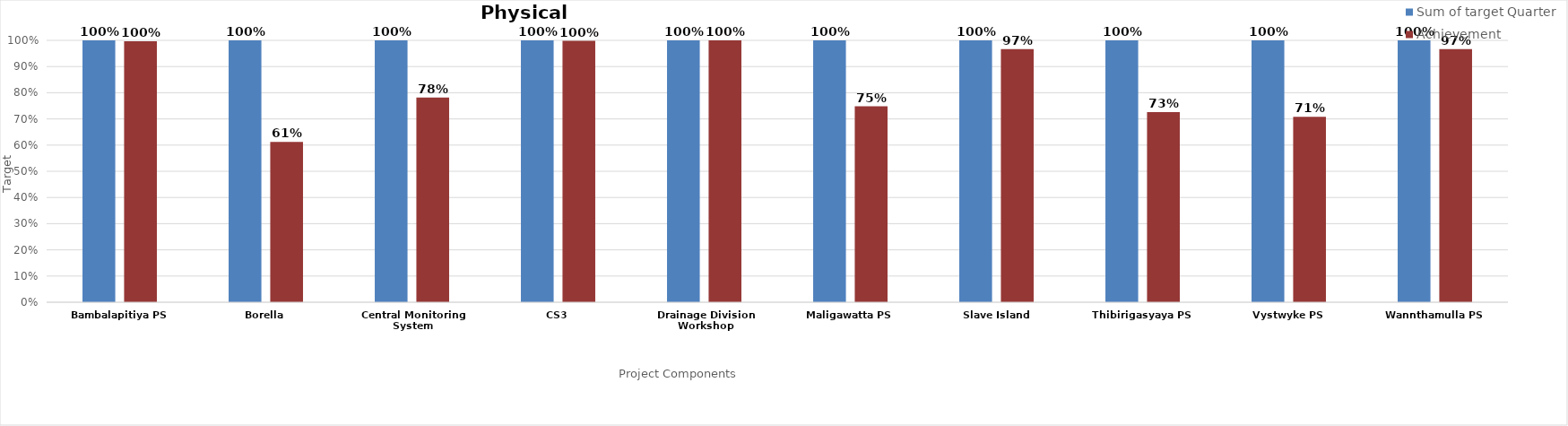
| Category | Sum of target Quarter | Achievement |
|---|---|---|
| Bambalapitiya PS | 1 | 0.997 |
| Borella | 1 | 0.612 |
| Central Monitoring System | 1 | 0.782 |
| CS3 | 1 | 0.998 |
| Drainage Division Workshop | 1 | 1 |
| Maligawatta PS | 1 | 0.748 |
| Slave Island | 1 | 0.966 |
| Thibirigasyaya PS | 1 | 0.726 |
| Vystwyke PS | 1 | 0.708 |
| Wannthamulla PS | 1 | 0.967 |